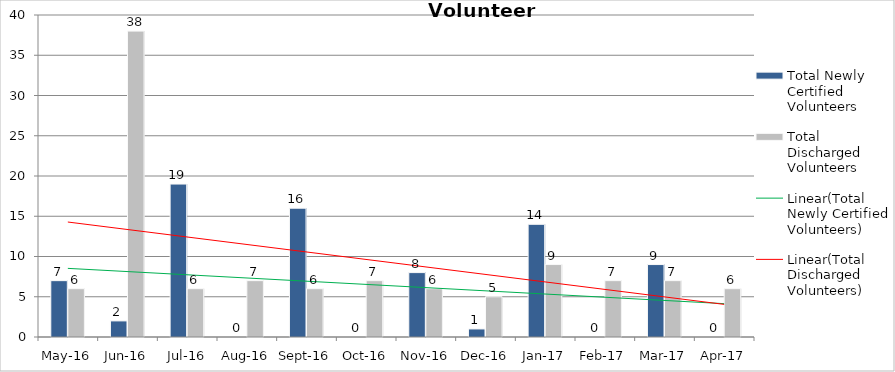
| Category | Total Newly Certified Volunteers | Total Discharged Volunteers |
|---|---|---|
| May-16 | 7 | 6 |
| Jun-16 | 2 | 38 |
| Jul-16 | 19 | 6 |
| Aug-16 | 0 | 7 |
| Sep-16 | 16 | 6 |
| Oct-16 | 0 | 7 |
| Nov-16 | 8 | 6 |
| Dec-16 | 1 | 5 |
| Jan-17 | 14 | 9 |
| Feb-17 | 0 | 7 |
| Mar-17 | 9 | 7 |
| Apr-17 | 0 | 6 |